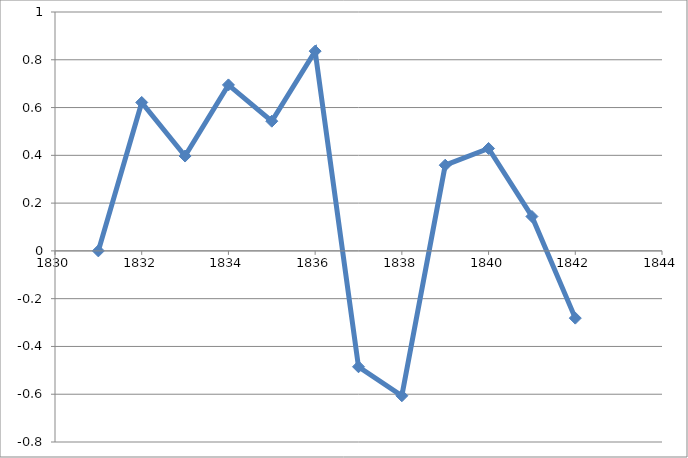
| Category | Series 0 |
|---|---|
| 1831.0 | 0 |
| 1832.0 | 0.621 |
| 1833.0 | 0.397 |
| 1834.0 | 0.695 |
| 1835.0 | 0.543 |
| 1836.0 | 0.836 |
| 1837.0 | -0.485 |
| 1838.0 | -0.606 |
| 1839.0 | 0.359 |
| 1840.0 | 0.429 |
| 1841.0 | 0.144 |
| 1842.0 | -0.281 |